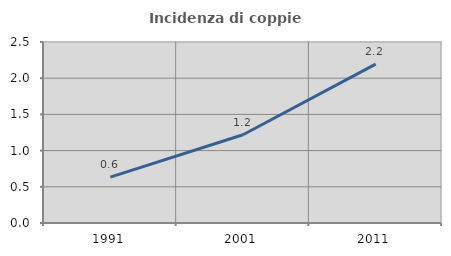
| Category | Incidenza di coppie miste |
|---|---|
| 1991.0 | 0.634 |
| 2001.0 | 1.22 |
| 2011.0 | 2.193 |